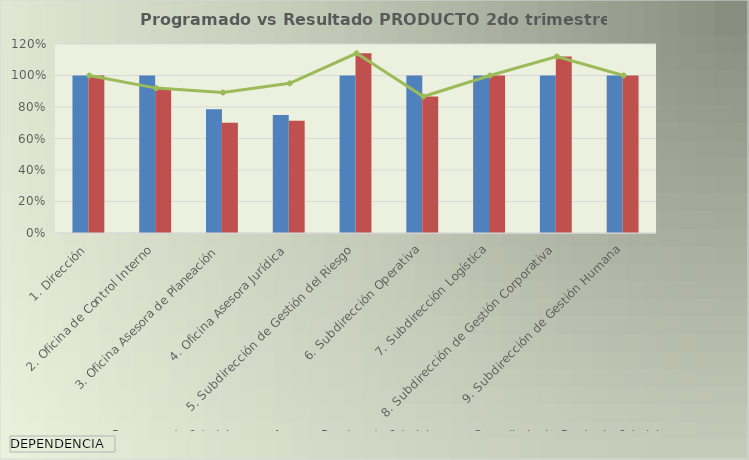
| Category | Programado 2do tri. | Avance Ponderado 2do tri. |
|---|---|---|
| 1. Dirección | 1 | 1 |
| 2. Oficina de Control Interno | 1 | 0.92 |
| 3. Oficina Asesora de Planeación | 0.785 | 0.7 |
| 4. Oficina Asesora Jurídica | 0.75 | 0.713 |
| 5. Subdirección de Gestión del Riesgo | 1 | 1.141 |
| 6. Subdirección Operativa | 1 | 0.867 |
| 7. Subdirección Logística | 1 | 1 |
| 8. Subdirección de Gestión Corporativa | 1 | 1.121 |
| 9. Subdirección de Gestión Humana | 1 | 1 |